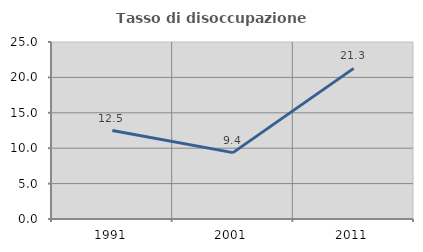
| Category | Tasso di disoccupazione giovanile  |
|---|---|
| 1991.0 | 12.5 |
| 2001.0 | 9.375 |
| 2011.0 | 21.277 |